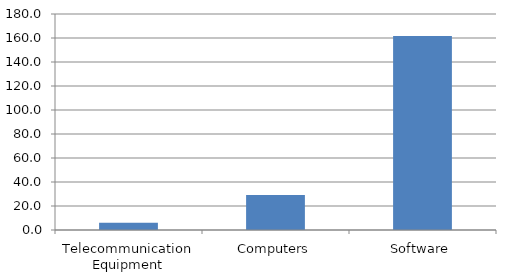
| Category | Series 0 |
|---|---|
| Telecommunication Equipment | 6.053 |
| Computers | 29.202 |
| Software | 161.725 |